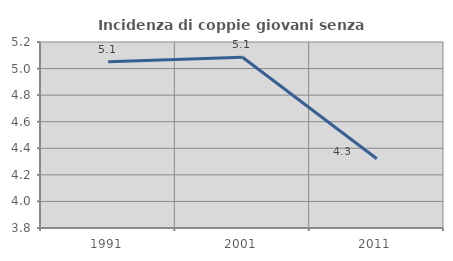
| Category | Incidenza di coppie giovani senza figli |
|---|---|
| 1991.0 | 5.051 |
| 2001.0 | 5.085 |
| 2011.0 | 4.321 |